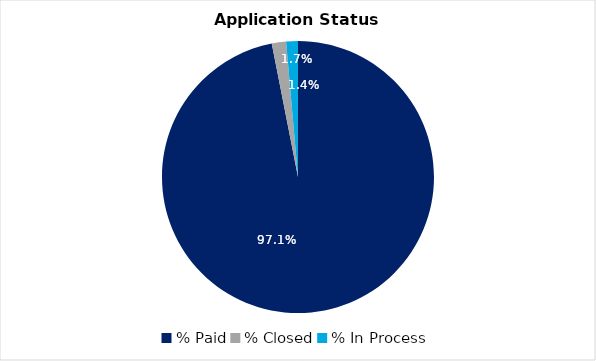
| Category | Series 0 |
|---|---|
| % Paid | 0.971 |
| % Closed | 0.017 |
| % In Process | 0.014 |